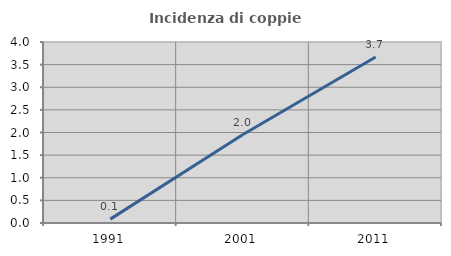
| Category | Incidenza di coppie miste |
|---|---|
| 1991.0 | 0.086 |
| 2001.0 | 1.956 |
| 2011.0 | 3.667 |